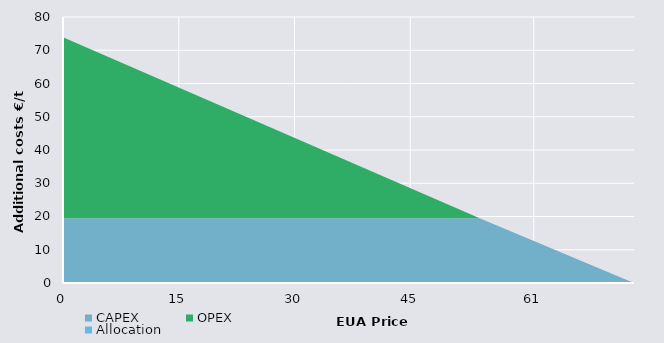
| Category | CAPEX | OPEX | Allocation |
|---|---|---|---|
| 0.0 | 19.504 | 54.411 | 0 |
| 54.41096393628353 | 19.504 | 0 | 0 |
| 73.91536395656176 | 0 | 0 | 0 |